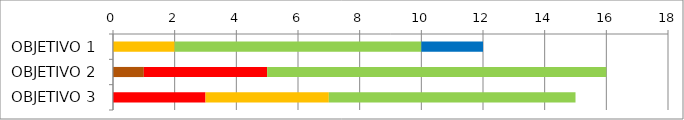
| Category | Series 0 | Series 1 | Series 2 | Series 3 | Series 4 | Series 5 |
|---|---|---|---|---|---|---|
| OBJETIVO 1 | 0 | 0 | 0 | 2 | 8 | 2 |
| OBJETIVO 2 | 1 | 0 | 4 | 0 | 11 | 0 |
| OBJETIVO 3 | 0 | 0 | 3 | 4 | 8 | 0 |